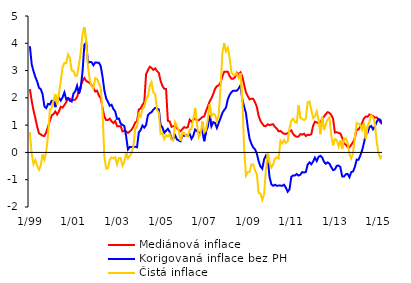
| Category | Mediánová inflace | Korigovaná inflace bez PH | Čistá inflace |
|---|---|---|---|
|  1/99 | 2.321 | 3.893 | 0.74 |
| 2 | 1.884 | 3.224 | -0.066 |
| 3 | 1.54 | 2.975 | -0.434 |
| 4 | 1.255 | 2.761 | -0.278 |
| 5 | 0.95 | 2.599 | -0.49 |
| 6 | 0.702 | 2.368 | -0.637 |
| 7 | 0.658 | 2.317 | -0.478 |
| 8 | 0.616 | 2.13 | -0.075 |
| 9 | 0.6 | 1.687 | -0.267 |
| 10 | 0.741 | 1.626 | 0.032 |
| 11 | 0.943 | 1.777 | 0.64 |
| 12 | 1.161 | 1.759 | 1.551 |
|  1/00 | 1.357 | 1.892 | 1.629 |
| 2 | 1.405 | 1.884 | 1.907 |
| 3 | 1.499 | 1.661 | 2.137 |
| 4 | 1.391 | 1.972 | 1.755 |
| 5 | 1.503 | 2.005 | 2.168 |
| 6 | 1.674 | 1.9 | 2.621 |
| 7 | 1.644 | 2.02 | 3.125 |
| 8 | 1.736 | 2.198 | 3.279 |
| 9 | 1.844 | 1.95 | 3.273 |
| 10 | 1.977 | 1.995 | 3.591 |
| 11 | 1.967 | 1.894 | 3.462 |
| 12 | 1.929 | 1.865 | 2.998 |
|  1/01 | 1.922 | 2.158 | 2.992 |
| 2 | 1.935 | 2.24 | 2.809 |
| 3 | 2.029 | 2.443 | 2.814 |
| 4 | 2.266 | 2.147 | 3.22 |
| 5 | 2.437 | 2.386 | 3.667 |
| 6 | 2.617 | 2.966 | 4.36 |
| 7 | 2.728 | 3.942 | 4.596 |
| 8 | 2.625 | 4.035 | 4.082 |
| 9 | 2.582 | 3.277 | 3.122 |
| 10 | 2.537 | 3.319 | 2.65 |
| 11 | 2.468 | 3.306 | 2.419 |
| 12 | 2.367 | 3.196 | 2.358 |
|  1/02 | 2.231 | 3.298 | 2.726 |
| 2 | 2.263 | 3.291 | 2.685 |
| 3 | 2.078 | 3.287 | 2.526 |
| 4 | 1.992 | 3.167 | 2.382 |
| 5 | 1.632 | 2.778 | 1.488 |
| 6 | 1.318 | 2.279 | -0.139 |
| 7 | 1.187 | 1.98 | -0.591 |
| 8 | 1.189 | 1.852 | -0.579 |
| 9 | 1.238 | 1.709 | -0.269 |
| 10 | 1.138 | 1.747 | -0.182 |
| 11 | 1.074 | 1.588 | -0.221 |
| 12 | 1.152 | 1.502 | -0.178 |
|  1/03 | 0.962 | 1.23 | -0.439 |
| 2 | 0.955 | 1.244 | -0.209 |
| 3 | 0.972 | 1.058 | -0.204 |
| 4 | 0.77 | 1.011 | -0.488 |
| 5 | 0.793 | 0.968 | -0.361 |
| 6 | 0.769 | 0.594 | -0.022 |
| 7 | 0.713 | 0.111 | -0.217 |
| 8 | 0.765 | 0.197 | -0.126 |
| 9 | 0.834 | 0.198 | -0.019 |
| 10 | 0.937 | 0.211 | 0.233 |
| 11 | 1.097 | 0.207 | 0.867 |
| 12 | 1.143 | 0.19 | 0.946 |
|  1/04 | 1.577 | 0.738 | 1.401 |
| 2 | 1.609 | 0.819 | 1.32 |
| 3 | 1.742 | 0.985 | 1.58 |
| 4 | 1.845 | 0.91 | 1.66 |
| 5 | 2.87 | 1.006 | 1.949 |
| 6 | 3.013 | 1.362 | 2.053 |
| 7 | 3.141 | 1.438 | 2.431 |
| 8 | 3.096 | 1.476 | 2.582 |
| 9 | 3.023 | 1.57 | 2.196 |
| 10 | 3.082 | 1.633 | 2.134 |
| 11 | 2.985 | 1.607 | 1.557 |
| 12 | 2.916 | 1.576 | 1.458 |
|  1/05 | 2.622 | 1.005 | 0.672 |
| 2 | 2.437 | 0.917 | 0.696 |
| 3 | 2.332 | 0.718 | 0.498 |
| 4 | 2.324 | 0.793 | 0.638 |
| 5 | 1.158 | 0.867 | 0.577 |
| 6 | 1.136 | 0.751 | 0.676 |
| 7 | 0.942 | 0.496 | 0.462 |
| 8 | 0.963 | 0.513 | 0.432 |
| 9 | 0.985 | 0.625 | 1.108 |
| 10 | 0.893 | 0.475 | 0.973 |
| 11 | 0.824 | 0.438 | 0.792 |
| 12 | 0.781 | 0.41 | 0.427 |
|  1/06 | 0.859 | 0.615 | 0.707 |
| 2 | 0.927 | 0.609 | 0.712 |
| 3 | 0.901 | 0.629 | 0.606 |
| 4 | 0.925 | 0.614 | 0.585 |
| 5 | 1.199 | 0.68 | 0.834 |
| 6 | 1.127 | 0.5 | 0.864 |
| 7 | 1.196 | 0.611 | 1.23 |
| 8 | 1.242 | 0.84 | 1.632 |
| 9 | 1.185 | 0.786 | 1.046 |
| 10 | 1.182 | 0.726 | 0.564 |
| 11 | 1.237 | 0.717 | 0.686 |
| 12 | 1.3 | 0.884 | 1.137 |
|  1/07 | 1.319 | 0.412 | 0.731 |
| 2 | 1.518 | 0.762 | 0.809 |
| 3 | 1.682 | 0.937 | 1.217 |
| 4 | 1.866 | 1.37 | 1.764 |
| 5 | 1.99 | 0.958 | 1.322 |
| 6 | 2.142 | 1.111 | 1.418 |
| 7 | 2.336 | 1.076 | 1.372 |
| 8 | 2.426 | 0.898 | 1.143 |
| 9 | 2.461 | 1.085 | 1.387 |
| 10 | 2.563 | 1.253 | 2.354 |
| 11 | 2.773 | 1.446 | 3.629 |
| 12 | 2.953 | 1.554 | 3.999 |
|  1/08 | 2.96 | 1.641 | 3.709 |
| 2 | 2.96 | 1.944 | 3.843 |
| 3 | 2.796 | 2.103 | 3.475 |
| 4 | 2.704 | 2.209 | 2.933 |
| 5 | 2.7 | 2.262 | 2.85 |
| 6 | 2.762 | 2.255 | 2.836 |
| 7 | 2.921 | 2.264 | 2.9 |
| 8 | 2.872 | 2.342 | 2.726 |
| 9 | 2.934 | 2.455 | 2.905 |
| 10 | 2.789 | 1.941 | 1.932 |
| 11 | 2.488 | 1.683 | 0.146 |
| 12 | 2.203 | 1.443 | -0.851 |
|  1/09 | 2.064 | 0.923 | -0.717 |
| 2 | 1.945 | 0.504 | -0.725 |
| 3 | 1.965 | 0.32 | -0.445 |
| 4 | 1.964 | 0.184 | -0.435 |
| 5 | 1.842 | 0.117 | -0.66 |
| 6 | 1.674 | -0.047 | -0.793 |
| 7 | 1.334 | -0.324 | -1.483 |
| 8 | 1.155 | -0.516 | -1.504 |
| 9 | 1.055 | -0.596 | -1.744 |
| 10 | 0.966 | -0.255 | -1.531 |
| 11 | 0.963 | -0.115 | -0.622 |
| 12 | 1.031 | -0.205 | 0.006 |
|  1/10 | 0.996 | -0.903 | -0.382 |
| 2 | 1.024 | -1.169 | -0.554 |
| 3 | 1.033 | -1.223 | -0.443 |
| 4 | 0.93 | -1.185 | -0.225 |
| 5 | 0.877 | -1.221 | -0.176 |
| 6 | 0.772 | -1.215 | -0.225 |
| 7 | 0.786 | -1.216 | 0.429 |
| 8 | 0.732 | -1.223 | 0.335 |
| 9 | 0.684 | -1.184 | 0.455 |
| 10 | 0.678 | -1.29 | 0.341 |
| 11 | 0.702 | -1.441 | 0.397 |
| 12 | 0.762 | -1.351 | 0.88 |
|  1/11 | 0.811 | -0.891 | 1.165 |
| 2 | 0.68 | -0.842 | 1.235 |
| 3 | 0.607 | -0.842 | 1.117 |
| 4 | 0.574 | -0.791 | 1.085 |
| 5 | 0.582 | -0.85 | 1.726 |
| 6 | 0.672 | -0.817 | 1.266 |
| 7 | 0.652 | -0.719 | 1.227 |
| 8 | 0.687 | -0.737 | 1.186 |
| 9 | 0.601 | -0.717 | 1.241 |
| 10 | 0.647 | -0.445 | 1.839 |
| 11 | 0.64 | -0.365 | 1.866 |
| 12 | 0.665 | -0.433 | 1.553 |
|  1/12 | 0.976 | -0.335 | 1.259 |
| 2 | 1.126 | -0.192 | 1.325 |
| 3 | 1.096 | -0.314 | 1.503 |
| 4 | 1.078 | -0.164 | 1.181 |
| 5 | 1.105 | -0.125 | 0.667 |
| 6 | 1.217 | -0.183 | 1.307 |
| 7 | 1.316 | -0.345 | 0.824 |
| 8 | 1.406 | -0.416 | 1.045 |
| 9 | 1.477 | -0.365 | 1.213 |
| 10 | 1.447 | -0.414 | 1.277 |
| 11 | 1.372 | -0.536 | 0.628 |
| 12 | 1.239 | -0.65 | 0.259 |
|  1/13 | 0.726 | -0.62 | 0.489 |
| 2 | 0.741 | -0.494 | 0.459 |
| 3 | 0.712 | -0.479 | 0.222 |
| 4 | 0.695 | -0.536 | 0.442 |
| 5 | 0.542 | -0.879 | 0.13 |
| 6 | 0.335 | -0.884 | 0.51 |
| 7 | 0.288 | -0.802 | 0.514 |
| 8 | 0.195 | -0.787 | 0.353 |
| 9 | 0.18 | -0.909 | -0.063 |
| 10 | 0.28 | -0.723 | -0.223 |
| 11 | 0.373 | -0.698 | -0.011 |
| 12 | 0.535 | -0.531 | 0.527 |
|  1/14 | 0.836 | -0.264 | 1.075 |
| 2 | 0.842 | -0.268 | 1.05 |
| 3 | 0.945 | -0.114 | 1.029 |
| 4 | 1.081 | 0.078 | 0.831 |
| 5 | 1.248 | 0.346 | 1.085 |
| 6 | 1.315 | 0.675 | 0.504 |
| 7 | 1.31 | 0.717 | 0.96 |
| 8 | 1.391 | 0.929 | 1.124 |
| 9 | 1.371 | 0.97 | 1.365 |
| 10 | 1.327 | 0.848 | 1.281 |
| 11 | 1.278 | 0.948 | 1.069 |
| 12 | 1.286 | 1.12 | 0.411 |
|  1/15 | 1.216 | 1.22 | -0.027 |
| 2 | 1.112 | 1.195 | -0.204 |
| 3 | 1.043 | 1.05 | -0.11 |